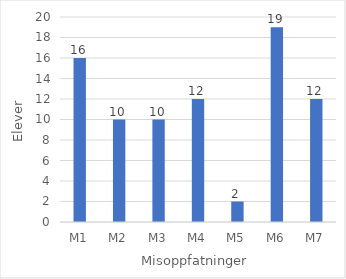
| Category | Series 0 |
|---|---|
| M1 | 16 |
| M2 | 10 |
| M3 | 10 |
| M4 | 12 |
| M5 | 2 |
| M6 | 19 |
| M7 | 12 |